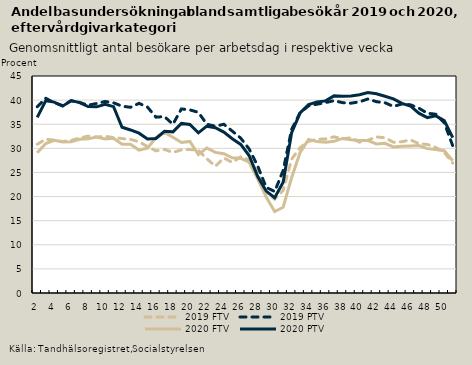
| Category | 2019 | 2020 |
|---|---|---|
| 2.0 | 38.624 | 36.427 |
| 3.0 | 40.377 | 39.875 |
| 4.0 | 39.466 | 39.585 |
| 5.0 | 38.852 | 38.752 |
| 6.0 | 39.85 | 39.92 |
| 7.0 | 39.51 | 39.492 |
| 8.0 | 38.952 | 38.66 |
| 9.0 | 39.295 | 38.605 |
| 10.0 | 39.714 | 39.131 |
| 11.0 | 39.438 | 38.64 |
| 12.0 | 38.748 | 34.374 |
| 13.0 | 38.51 | 33.812 |
| 14.0 | 39.329 | 33.147 |
| 15.0 | 38.549 | 31.947 |
| 16.0 | 36.461 | 32.041 |
| 17.0 | 36.59 | 33.544 |
| 18.0 | 34.991 | 33.42 |
| 19.0 | 38.169 | 35.172 |
| 20.0 | 37.972 | 34.958 |
| 21.0 | 37.467 | 33.218 |
| 22.0 | 34.997 | 34.597 |
| 23.0 | 34.582 | 34.286 |
| 24.0 | 34.998 | 33.369 |
| 25.0 | 33.572 | 31.99 |
| 26.0 | 32.109 | 30.803 |
| 27.0 | 29.831 | 28.467 |
| 28.0 | 26.308 | 24.15 |
| 29.0 | 21.902 | 21.14 |
| 30.0 | 21.041 | 19.749 |
| 31.0 | 25.407 | 22.988 |
| 32.0 | 33.922 | 33.234 |
| 33.0 | 37.41 | 37.358 |
| 34.0 | 38.808 | 39.069 |
| 35.0 | 39.158 | 39.622 |
| 36.0 | 39.482 | 39.836 |
| 37.0 | 39.885 | 40.876 |
| 38.0 | 39.478 | 40.783 |
| 39.0 | 39.36 | 40.864 |
| 40.0 | 39.648 | 41.106 |
| 41.0 | 40.231 | 41.567 |
| 42.0 | 39.672 | 41.324 |
| 43.0 | 39.463 | 40.801 |
| 44.0 | 38.69 | 40.265 |
| 45.0 | 39.196 | 39.311 |
| 46.0 | 39.031 | 38.783 |
| 47.0 | 38.331 | 37.284 |
| 48.0 | 37.277 | 36.378 |
| 49.0 | 37.073 | 36.741 |
| 50.0 | 35.286 | 35.757 |
| 51.0 | 30.516 | 32.224 |